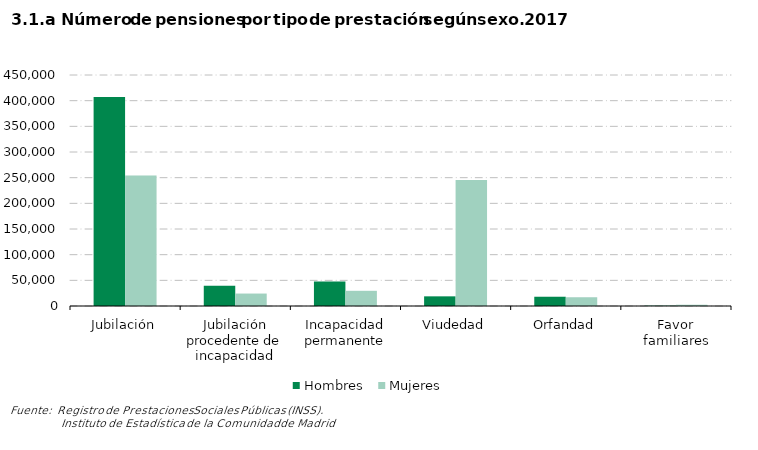
| Category | Hombres | Mujeres |
|---|---|---|
| Jubilación | 406926 | 254120 |
| Jubilación procedente de incapacidad | 39428 | 24253 |
| Incapacidad permanente | 47654 | 29597 |
| Viudedad | 18815 | 245556 |
| Orfandad | 18043 | 17001 |
| Favor familiares | 629 | 2300 |